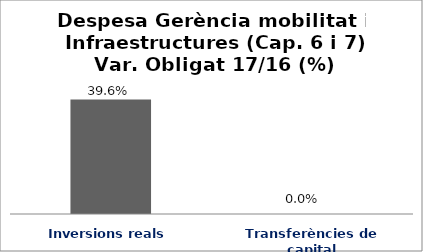
| Category | Series 0 |
|---|---|
| Inversions reals | 0.396 |
| Transferències de capital | 0 |